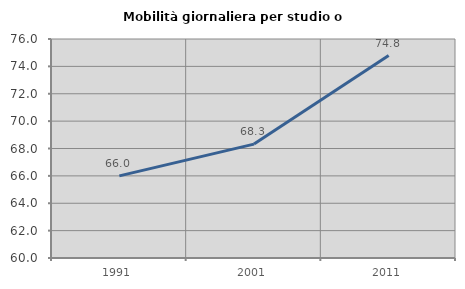
| Category | Mobilità giornaliera per studio o lavoro |
|---|---|
| 1991.0 | 66.003 |
| 2001.0 | 68.321 |
| 2011.0 | 74.79 |